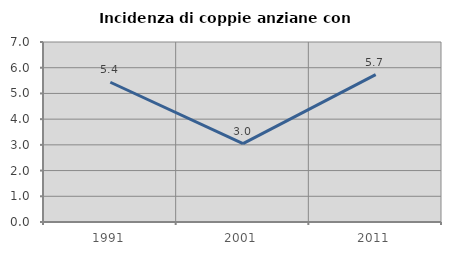
| Category | Incidenza di coppie anziane con figli |
|---|---|
| 1991.0 | 5.435 |
| 2001.0 | 3.049 |
| 2011.0 | 5.732 |